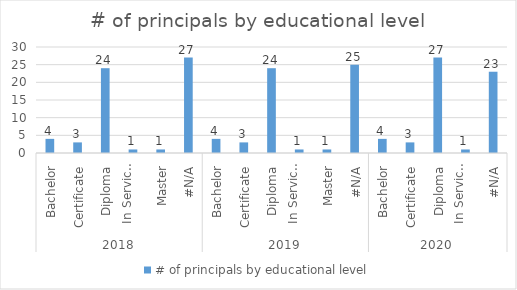
| Category | # of principals by educational level |
|---|---|
| 0 | 4 |
| 1 | 3 |
| 2 | 24 |
| 3 | 1 |
| 4 | 1 |
| 5 | 27 |
| 6 | 4 |
| 7 | 3 |
| 8 | 24 |
| 9 | 1 |
| 10 | 1 |
| 11 | 25 |
| 12 | 4 |
| 13 | 3 |
| 14 | 27 |
| 15 | 1 |
| 16 | 23 |